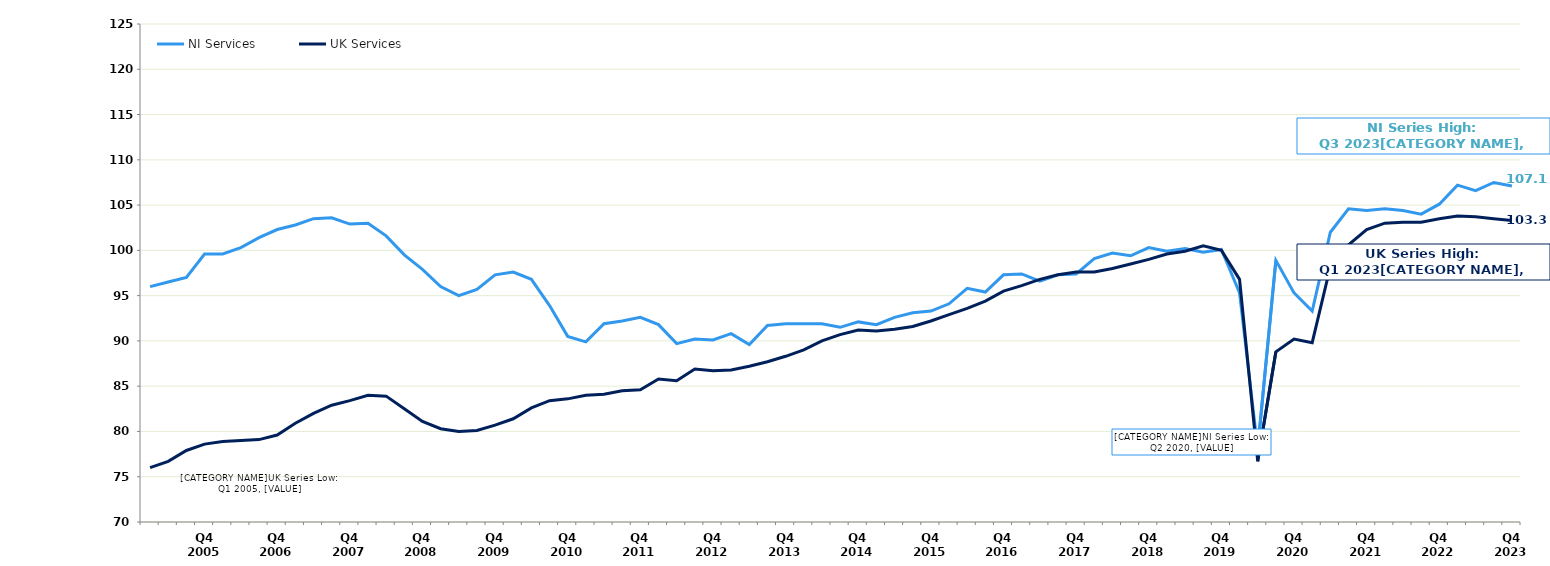
| Category | NI Services | UK Services |
|---|---|---|
|  | 96 | 76 |
|  | 96.5 | 76.7 |
|  | 97 | 77.9 |
| Q4 2005 | 99.6 | 78.6 |
|  | 99.6 | 78.9 |
|  | 100.3 | 79 |
|  | 101.4 | 79.1 |
| Q4 2006 | 102.3 | 79.6 |
|  | 102.8 | 80.9 |
|  | 103.5 | 82 |
|  | 103.6 | 82.9 |
| Q4 2007 | 102.9 | 83.4 |
|  | 103 | 84 |
|  | 101.6 | 83.9 |
|  | 99.5 | 82.5 |
| Q4 2008 | 97.9 | 81.1 |
|  | 96 | 80.3 |
|  | 95 | 80 |
|  | 95.7 | 80.1 |
| Q4 2009 | 97.3 | 80.7 |
|  | 97.6 | 81.4 |
|  | 96.8 | 82.6 |
|  | 93.9 | 83.4 |
| Q4 2010 | 90.5 | 83.6 |
|  | 89.9 | 84 |
|  | 91.9 | 84.1 |
|  | 92.2 | 84.5 |
| Q4 2011 | 92.6 | 84.6 |
|  | 91.8 | 85.8 |
|  | 89.7 | 85.6 |
|  | 90.2 | 86.9 |
| Q4 2012 | 90.1 | 86.7 |
|  | 90.8 | 86.8 |
|  | 89.6 | 87.2 |
|  | 91.7 | 87.7 |
| Q4 2013 | 91.9 | 88.3 |
|  | 91.9 | 89 |
|  | 91.9 | 90 |
|  | 91.5 | 90.7 |
| Q4 2014 | 92.1 | 91.2 |
|  | 91.8 | 91.1 |
|  | 92.6 | 91.3 |
|  | 93.1 | 91.6 |
| Q4 2015 | 93.3 | 92.2 |
|  | 94.1 | 92.9 |
|  | 95.8 | 93.6 |
|  | 95.4 | 94.4 |
| Q4 2016 | 97.3 | 95.5 |
|  | 97.4 | 96.1 |
|  | 96.6 | 96.8 |
|  | 97.3 | 97.3 |
| Q4 2017 | 97.4 | 97.6 |
|  | 99.1 | 97.6 |
|  | 99.7 | 98 |
|  | 99.4 | 98.5 |
| Q4 2018 | 100.3 | 99 |
|  | 99.9 | 99.6 |
|  | 100.2 | 99.9 |
|  | 99.8 | 100.5 |
| Q4 2019 | 100.1 | 100 |
|  | 95.3 | 96.8 |
|  | 78.1 | 76.7 |
|  | 98.9 | 88.8 |
| Q4 2020 | 95.3 | 90.2 |
|  | 93.3 | 89.8 |
|  | 102 | 98.2 |
|  | 104.6 | 100.6 |
| Q4 2021 | 104.4 | 102.3 |
|  | 104.6 | 103 |
|  | 104.4 | 103.1 |
|  | 104 | 103.1 |
| Q4 2022 | 105.1 | 103.5 |
|  | 107.2 | 103.8 |
|  | 106.6 | 103.7 |
|  | 107.5 | 103.5 |
| Q4 2023 | 107.1 | 103.3 |